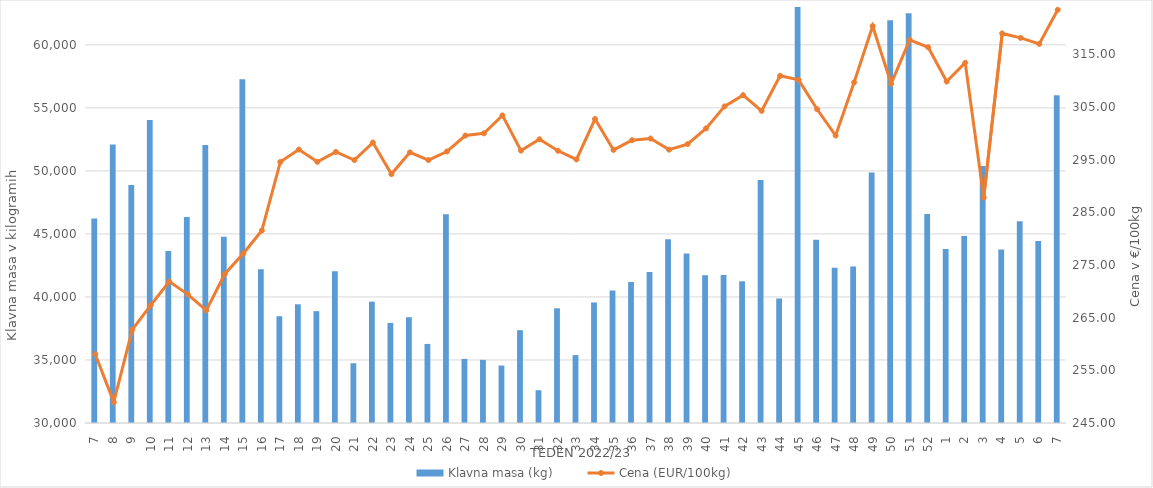
| Category | Klavna masa (kg) |
|---|---|
| 7.0 | 46227 |
| 8.0 | 52099 |
| 9.0 | 48872 |
| 10.0 | 54045 |
| 11.0 | 43645 |
| 12.0 | 46350 |
| 13.0 | 52061 |
| 14.0 | 44774 |
| 15.0 | 57268 |
| 16.0 | 42191 |
| 17.0 | 38469 |
| 18.0 | 39417 |
| 19.0 | 38876 |
| 20.0 | 42047 |
| 21.0 | 34739 |
| 22.0 | 39626 |
| 23.0 | 37939 |
| 24.0 | 38390 |
| 25.0 | 36272 |
| 26.0 | 46553 |
| 27.0 | 35085 |
| 28.0 | 35007 |
| 29.0 | 34559 |
| 30.0 | 37366 |
| 31.0 | 32599 |
| 32.0 | 39100 |
| 33.0 | 35388 |
| 34.0 | 39563 |
| 35.0 | 40507 |
| 36.0 | 41176 |
| 37.0 | 41983 |
| 38.0 | 44572 |
| 39.0 | 43447 |
| 40.0 | 41711 |
| 41.0 | 41736 |
| 42.0 | 41239 |
| 43.0 | 49284 |
| 44.0 | 39877 |
| 45.0 | 63668 |
| 46.0 | 44528 |
| 47.0 | 42319 |
| 48.0 | 42416 |
| 49.0 | 49873 |
| 50.0 | 61942 |
| 51.0 | 62514 |
| 52.0 | 46589 |
| 1.0 | 43807 |
| 2.0 | 44834 |
| 3.0 | 50386 |
| 4.0 | 43773 |
| 5.0 | 46011 |
| 6.0 | 44439 |
| 7.0 | 56001 |